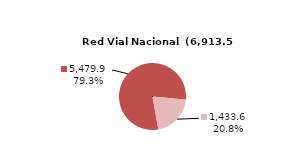
| Category | RV Nacional |
|---|---|
| Pavimentada | 5479.882 |
| No Pavimentada | 1433.619 |